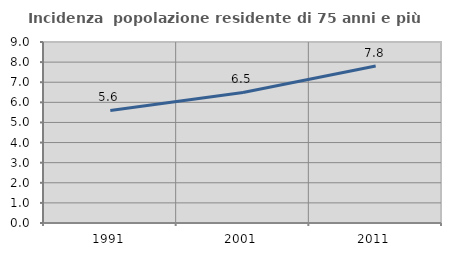
| Category | Incidenza  popolazione residente di 75 anni e più |
|---|---|
| 1991.0 | 5.598 |
| 2001.0 | 6.491 |
| 2011.0 | 7.806 |